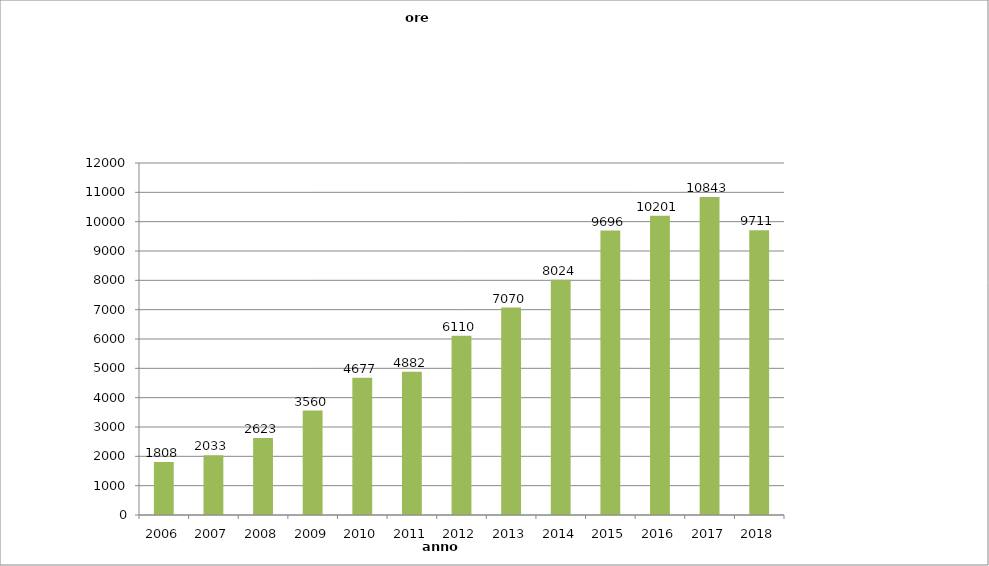
| Category | ore |
|---|---|
| 2006.0 | 1808 |
| 2007.0 | 2033 |
| 2008.0 | 2623 |
| 2009.0 | 3560 |
| 2010.0 | 4677 |
| 2011.0 | 4882 |
| 2012.0 | 6110 |
| 2013.0 | 7070 |
| 2014.0 | 8024 |
| 2015.0 | 9696 |
| 2016.0 | 10201 |
| 2017.0 | 10843 |
| 2018.0 | 9711 |